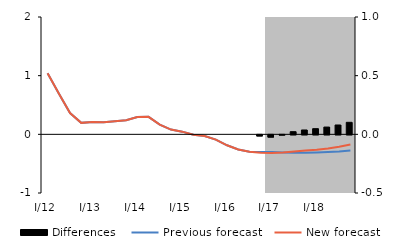
| Category | Differences |
|---|---|
| 0 | 0 |
| 1 | 0 |
| 2 | 0 |
| 3 | 0 |
| 4 | 0 |
| 5 | 0 |
| 6 | 0 |
| 7 | 0 |
| 8 | 0 |
| 9 | 0 |
| 10 | 0 |
| 11 | 0 |
| 12 | 0 |
| 13 | 0 |
| 14 | 0 |
| 15 | 0 |
| 16 | 0 |
| 17 | 0 |
| 18 | 0 |
| 19 | -0.01 |
| 20 | -0.019 |
| 21 | -0.002 |
| 22 | 0.023 |
| 23 | 0.037 |
| 24 | 0.048 |
| 25 | 0.062 |
| 26 | 0.08 |
| 27 | 0.102 |